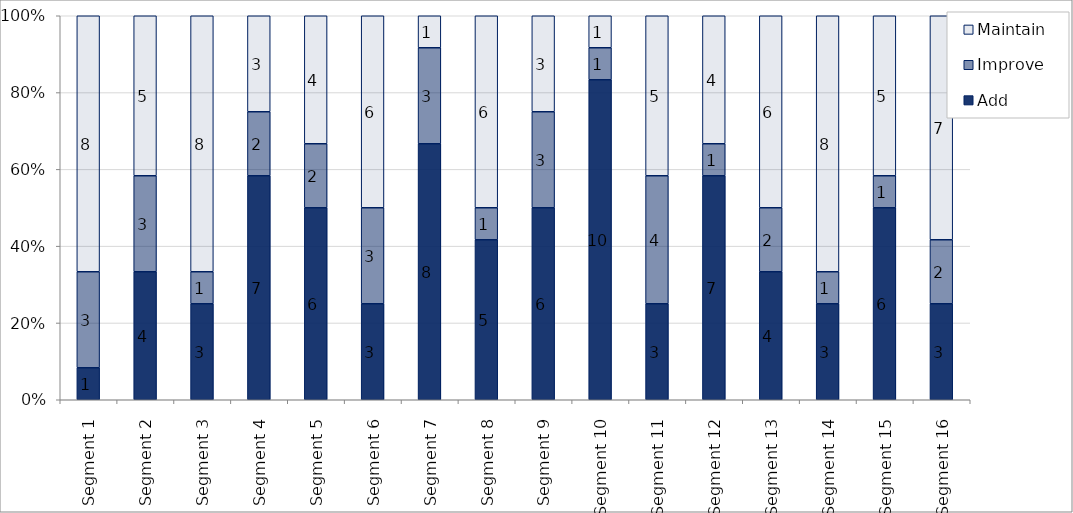
| Category | Add | Improve | Maintain |
|---|---|---|---|
| Segment 1 | 1 | 3 | 8 |
| Segment 2 | 4 | 3 | 5 |
| Segment 3 | 3 | 1 | 8 |
| Segment 4 | 7 | 2 | 3 |
| Segment 5 | 6 | 2 | 4 |
| Segment 6 | 3 | 3 | 6 |
| Segment 7 | 8 | 3 | 1 |
| Segment 8 | 5 | 1 | 6 |
| Segment 9 | 6 | 3 | 3 |
| Segment 10 | 10 | 1 | 1 |
| Segment 11 | 3 | 4 | 5 |
| Segment 12 | 7 | 1 | 4 |
| Segment 13 | 4 | 2 | 6 |
| Segment 14 | 3 | 1 | 8 |
| Segment 15 | 6 | 1 | 5 |
| Segment 16 | 3 | 2 | 7 |